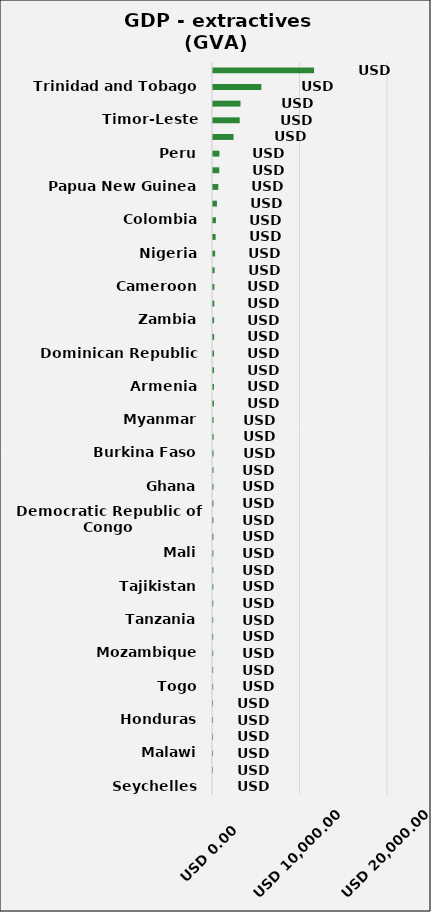
| Category | Total |
|---|---|
| Seychelles | 0 |
| Ethiopia | 2.162 |
| Malawi | 5.67 |
| Afghanistan | 6.749 |
| Honduras | 6.829 |
| Madagascar | 6.943 |
| Togo | 20.638 |
| Philippines | 21.92 |
| Mozambique | 24.259 |
| Senegal | 24.676 |
| Tanzania | 25.208 |
| Guatemala | 31.997 |
| Tajikistan | 34.373 |
| Niger | 41.36 |
| Mali | 43.299 |
| Sierra Leone | 51.974 |
| Democratic Republic of Congo | 52.055 |
| Guinea | 52.698 |
| Ghana | 53.698 |
| Germany | 56.13 |
| Burkina Faso | 59.42 |
| Côte d'Ivoire | 69.279 |
| Myanmar | 70.329 |
| Ukraine | 103.659 |
| Armenia | 108.909 |
| Kyrgyz Republic | 118.046 |
| Dominican Republic | 118.777 |
| Indonesia | 128.583 |
| Zambia | 130.136 |
| Albania | 145.744 |
| Cameroon | 153.74 |
| Chad | 183.889 |
| Nigeria | 242.409 |
| Mauritania | 297.989 |
| Colombia | 334.334 |
| United Kingdom | 449.292 |
| Papua New Guinea | 609.708 |
| Mongolia | 714.927 |
| Peru | 733.905 |
| Iraq | 2344.259 |
| Timor-Leste | 3052.046 |
| Kazakhstan | 3145.093 |
| Trinidad and Tobago | 5525.623 |
| Norway | 11547.056 |